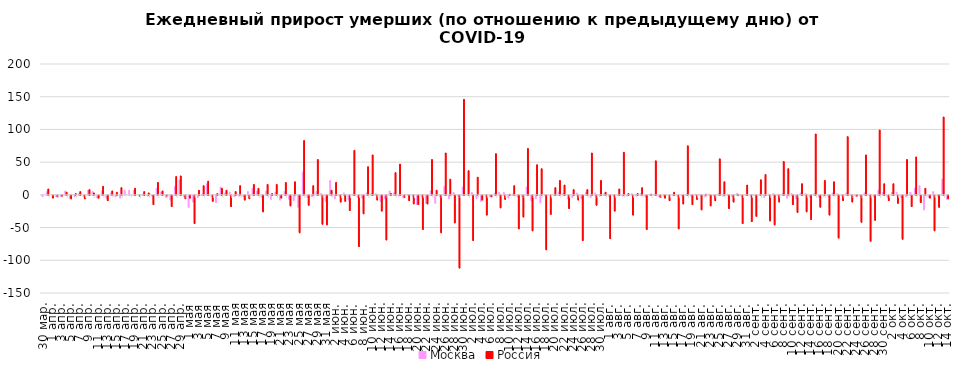
| Category | Москва | Россия |
|---|---|---|
| 2020-03-30 | -2 | 0 |
| 2020-03-31 | 5 | 9 |
| 2020-04-01 | 0 | -4 |
| 2020-04-02 | -2 | -2 |
| 2020-04-03 | -2 | -1 |
| 2020-04-04 | 6 | 4 |
| 2020-04-05 | -5 | -5 |
| 2020-04-06 | -2 | 2 |
| 2020-04-07 | 2 | 5 |
| 2020-04-08 | -2 | -5 |
| 2020-04-09 | 7 | 8 |
| 2020-04-10 | 5 | 3 |
| 2020-04-11 | -4 | -4 |
| 2020-04-12 | 6 | 13 |
| 2020-04-13 | -4 | -8 |
| 2020-04-14 | 3 | 6 |
| 2020-04-15 | -2 | 4 |
| 2020-04-16 | -4 | 11 |
| 2020-04-17 | 7 | 0 |
| 2020-04-18 | 7 | 0 |
| 2020-04-19 | 7 | 10 |
| 2020-04-20 | 0 | -1 |
| 2020-04-21 | 1 | 5 |
| 2020-04-22 | -1 | 3 |
| 2020-04-23 | -1 | -14 |
| 2020-04-24 | 10 | 19 |
| 2020-04-25 | 4 | 6 |
| 2020-04-26 | -3 | -1 |
| 2020-04-27 | -7 | -17 |
| 2020-04-28 | 13 | 28 |
| 2020-04-29 | 23 | 29 |
| 2020-04-30 | -2 | -5 |
| 2020-05-01 | -18 | -4 |
| 2020-05-02 | -10 | -43 |
| 2020-05-03 | -3 | 7 |
| 2020-05-04 | 1 | 14 |
| 2020-05-05 | 17 | 21 |
| 2020-05-06 | -2 | -9 |
| 2020-05-07 | -11 | 2 |
| 2020-05-08 | 12 | 10 |
| 2020-05-09 | 3 | 7 |
| 2020-05-10 | 4 | -17 |
| 2020-05-11 | -2 | 5 |
| 2020-05-12 | -1 | 14 |
| 2020-05-13 | -2 | -7 |
| 2020-05-14 | 5 | -5 |
| 2020-05-15 | 10 | 16 |
| 2020-05-16 | 6 | 10 |
| 2020-05-17 | -3 | -25 |
| 2020-05-18 | 6 | 16 |
| 2020-05-19 | -6 | 2 |
| 2020-05-20 | 4 | 16 |
| 2020-05-21 | -7 | -4 |
| 2020-05-22 | 5 | 19 |
| 2020-05-23 | -6 | -16 |
| 2020-05-24 | -8 | 20 |
| 2020-05-25 | -18 | -57 |
| 2020-05-26 | 35 | 83 |
| 2020-05-27 | -3 | -15 |
| 2020-05-28 | -2 | 14 |
| 2020-05-29 | 5 | 54 |
| 2020-05-30 | 2 | -44 |
| 2020-05-31 | -9 | -45 |
| 2020-06-01 | 22 | 7 |
| 2020-06-02 | -5 | 19 |
| 2020-06-03 | -1 | -10 |
| 2020-06-04 | 3 | -9 |
| 2020-06-05 | -7 | -23 |
| 2020-06-06 | 1 | 68 |
| 2020-06-07 | -3 | -78 |
| 2020-06-08 | -4 | -28 |
| 2020-06-09 | 3 | 43 |
| 2020-06-10 | 2 | 61 |
| 2020-06-11 | 2 | -7 |
| 2020-06-12 | -9 | -24 |
| 2020-06-13 | -5 | -68 |
| 2020-06-14 | 6 | 2 |
| 2020-06-15 | 3 | 34 |
| 2020-06-16 | -1 | 47 |
| 2020-06-17 | -4 | -3 |
| 2020-06-18 | 1 | -8 |
| 2020-06-19 | -1 | -13 |
| 2020-06-20 | -14 | -14 |
| 2020-06-21 | -2 | -52 |
| 2020-06-22 | -12 | -13 |
| 2020-06-23 | 6 | 54 |
| 2020-06-24 | -12 | 7 |
| 2020-06-25 | -2 | -57 |
| 2020-06-26 | 13 | 64 |
| 2020-06-27 | -5 | 24 |
| 2020-06-28 | 4 | -42 |
| 2020-06-29 | -1 | -111 |
| 2020-06-30 | 12 | 146 |
| 2020-07-01 | 0 | 37 |
| 2020-07-02 | 4 | -69 |
| 2020-07-03 | -5 | 27 |
| 2020-07-04 | -9 | -7 |
| 2020-07-05 | -1 | -30 |
| 2020-07-06 | -2 | -2 |
| 2020-07-07 | 2 | 63 |
| 2020-07-08 | 4 | -19 |
| 2020-07-09 | 4 | -6 |
| 2020-07-10 | -4 | 1 |
| 2020-07-11 | 1 | 14 |
| 2020-07-12 | -2 | -51 |
| 2020-07-13 | -2 | -33 |
| 2020-07-14 | 12 | 71 |
| 2020-07-15 | -8 | -54 |
| 2020-07-16 | -5 | 46 |
| 2020-07-17 | -11 | 40 |
| 2020-07-18 | 1 | -83 |
| 2020-07-19 | 0 | -29 |
| 2020-07-20 | 1 | 11 |
| 2020-07-21 | 4 | 22 |
| 2020-07-22 | 2 | 15 |
| 2020-07-23 | -5 | -20 |
| 2020-07-24 | -3 | 8 |
| 2020-07-25 | 3 | -7 |
| 2020-07-26 | -5 | -69 |
| 2020-07-27 | 4 | 8 |
| 2020-07-28 | -3 | 64 |
| 2020-07-29 | 3 | -15 |
| 2020-07-30 | -1 | 22 |
| 2020-07-31 | 2 | 4 |
| 2020-08-01 | -1 | -66 |
| 2020-08-02 | -1 | -24 |
| 2020-08-03 | 1 | 9 |
| 2020-08-04 | -1 | 65 |
| 2020-08-05 | -1 | 2 |
| 2020-08-06 | 2 | -30 |
| 2020-08-07 | -1 | 2 |
| 2020-08-08 | 2 | 11 |
| 2020-08-09 | -2 | -52 |
| 2020-08-10 | 1 | 1 |
| 2020-08-11 | 1 | 52 |
| 2020-08-12 | -2 | -3 |
| 2020-08-13 | -1 | -4 |
| 2020-08-14 | 0 | -8 |
| 2020-08-15 | 1 | 4 |
| 2020-08-16 | -1 | -51 |
| 2020-08-17 | -1 | -13 |
| 2020-08-18 | 1 | 75 |
| 2020-08-19 | -1 | -14 |
| 2020-08-20 | 1 | -6 |
| 2020-08-21 | 1 | -22 |
| 2020-08-22 | -2 | 1 |
| 2020-08-23 | 1 | -16 |
| 2020-08-24 | -1 | -8 |
| 2020-08-25 | 2 | 55 |
| 2020-08-26 | -1 | 20 |
| 2020-08-27 | 1 | -20 |
| 2020-08-28 | -2 | -10 |
| 2020-08-29 | 2 | 1 |
| 2020-08-30 | -1 | -43 |
| 2020-08-31 | 1 | 15 |
| 2020-09-01 | -1 | -40 |
| 2020-09-02 | 1 | -32 |
| 2020-09-03 | 1 | 23 |
| 2020-09-04 | -3 | 31 |
| 2020-09-05 | 1 | -39 |
| 2020-09-06 | 2 | -45 |
| 2020-09-07 | 1 | -10 |
| 2020-09-08 | 2 | 51 |
| 2020-09-09 | -4 | 40 |
| 2020-09-10 | 2 | -14 |
| 2020-09-11 | -5 | -26 |
| 2020-09-12 | 3 | 17 |
| 2020-09-13 | 2 | -25 |
| 2020-09-14 | -3 | -37 |
| 2020-09-15 | 2 | 93 |
| 2020-09-16 | -3 | -18 |
| 2020-09-17 | -1 | 22 |
| 2020-09-18 | -1 | -30 |
| 2020-09-19 | 3 | 20 |
| 2020-09-20 | 2 | -65 |
| 2020-09-21 | -1 | -8 |
| 2020-09-22 | 3 | 89 |
| 2020-09-23 | 1 | -10 |
| 2020-09-24 | -1 | -1 |
| 2020-09-25 | -1 | -41 |
| 2020-09-26 | 3 | 61 |
| 2020-09-27 | 1 | -70 |
| 2020-09-28 | -2 | -38 |
| 2020-09-29 | 7 | 99 |
| 2020-09-30 | 4 | 17 |
| 2020-10-01 | -3 | -8 |
| 2020-10-02 | 4 | 17 |
| 2020-10-03 | 4 | -12 |
| 2020-10-04 | -3 | -67 |
| 2020-10-05 | -2 | 54 |
| 2020-10-06 | 4 | -17 |
| 2020-10-07 | 10 | 58 |
| 2020-10-08 | 14 | -11 |
| 2020-10-09 | -22 | 10 |
| 2020-10-10 | -3 | -4 |
| 2020-10-11 | 5 | -54 |
| 2020-10-12 | -1 | -18 |
| 2020-10-13 | 24 | 119 |
| 2020-10-14 | -6 | -5 |